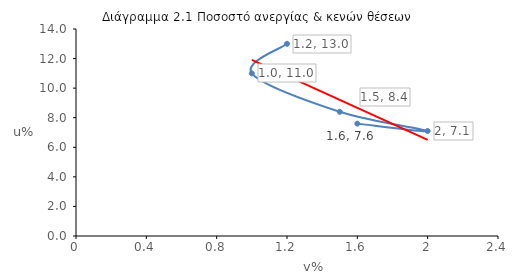
| Category | Ποσοστό ανεργίας |
|---|---|
| 1.2 | 13 |
| 1.0 | 11 |
| 1.5 | 8.4 |
| 2.0 | 7.1 |
| 1.6 | 7.6 |